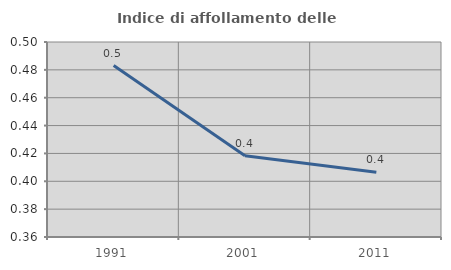
| Category | Indice di affollamento delle abitazioni  |
|---|---|
| 1991.0 | 0.483 |
| 2001.0 | 0.418 |
| 2011.0 | 0.407 |